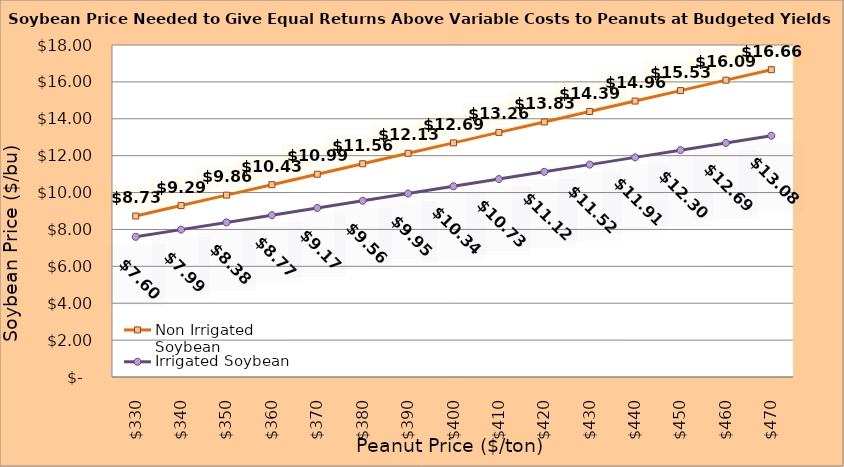
| Category | Non Irrigated Soybean | Irrigated Soybean |
|---|---|---|
| 330.0 | 8.728 | 7.599 |
| 340.0 | 9.294 | 7.99 |
| 350.0 | 9.861 | 8.382 |
| 360.0 | 10.428 | 8.774 |
| 370.0 | 10.994 | 9.165 |
| 380.0 | 11.561 | 9.557 |
| 390.0 | 12.128 | 9.949 |
| 400.0 | 12.694 | 10.34 |
| 410.0 | 13.261 | 10.732 |
| 420.0 | 13.828 | 11.124 |
| 430.0 | 14.394 | 11.515 |
| 440.0 | 14.961 | 11.907 |
| 450.0 | 15.528 | 12.299 |
| 460.0 | 16.094 | 12.69 |
| 470.0 | 16.661 | 13.082 |